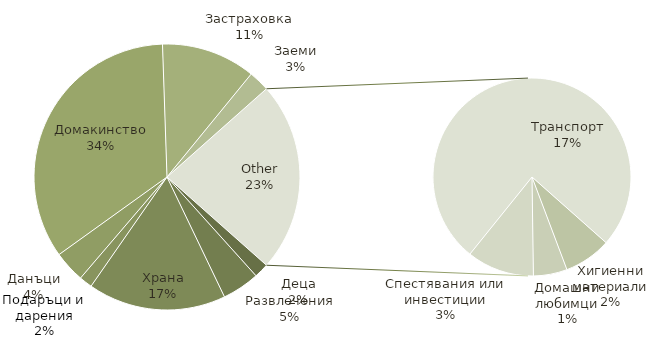
| Category | Общо |
|---|---|
| Деца | 140 |
| Развлечения | 358 |
| Храна | 1320 |
| Подаръци и дарения | 125 |
| Данъци | 300 |
| Домакинство | 2702 |
| Застраховка | 900 |
| Заеми | 200 |
| Хигиенни материали | 140 |
| Домашни любимци | 100 |
| Спестявания или инвестиции | 200 |
| Транспорт | 1375 |